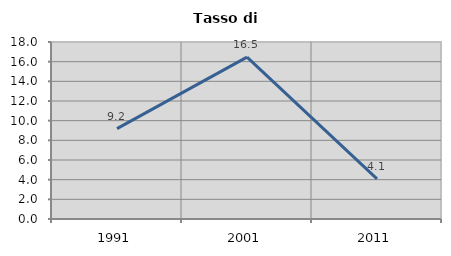
| Category | Tasso di disoccupazione   |
|---|---|
| 1991.0 | 9.188 |
| 2001.0 | 16.463 |
| 2011.0 | 4.078 |